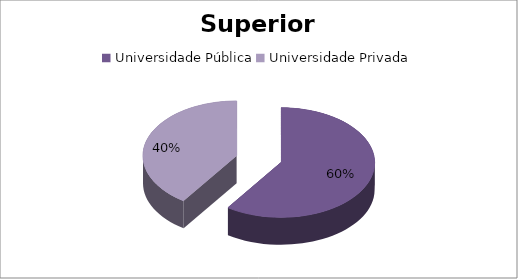
| Category | Masculino |
|---|---|
| Universidade Pública | 28 |
| Universidade Privada | 19 |